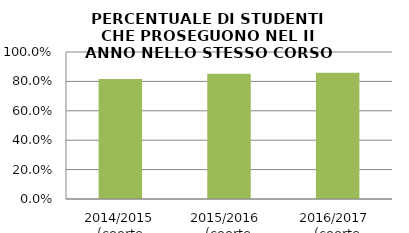
| Category | 2014/2015 (coorte 2013/14) 2015/2016  (coorte 2014/15) 2016/2017  (coorte 2015/16) |
|---|---|
| 2014/2015 (coorte 2013/14) | 0.816 |
| 2015/2016  (coorte 2014/15) | 0.852 |
| 2016/2017  (coorte 2015/16) | 0.86 |